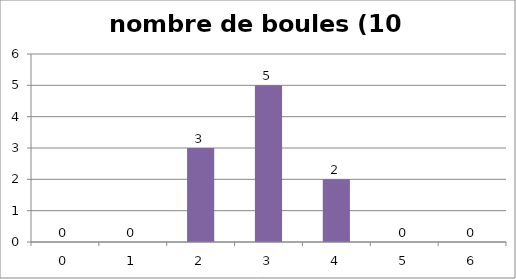
| Category | nombre de boules (10 lancers) |
|---|---|
| 0.0 | 0 |
| 1.0 | 0 |
| 2.0 | 3 |
| 3.0 | 5 |
| 4.0 | 2 |
| 5.0 | 0 |
| 6.0 | 0 |